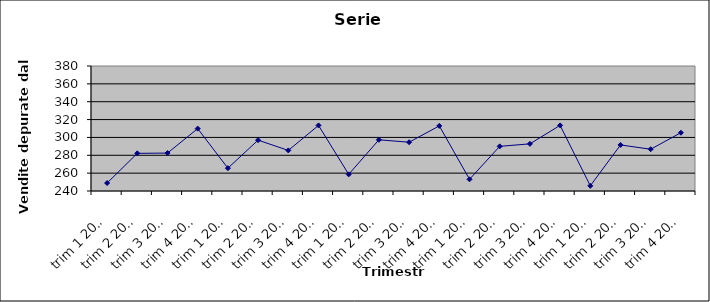
| Category | Serie detrendizzata |
|---|---|
| trim 1 2001 | 248.894 |
| trim 2 2001 | 282.187 |
| trim 3 2001 | 282.481 |
| trim 4 2001 | 309.875 |
| trim 1 2002 | 265.569 |
| trim 2 2002 | 296.962 |
| trim 3 2002 | 285.456 |
| trim 4 2002 | 313.45 |
| trim 1 2003 | 258.644 |
| trim 2 2003 | 297.337 |
| trim 3 2003 | 294.631 |
| trim 4 2003 | 312.925 |
| trim 1 2004 | 253.119 |
| trim 2 2004 | 290.012 |
| trim 3 2004 | 292.806 |
| trim 4 2004 | 313.5 |
| trim 1 2005 | 245.794 |
| trim 2 2005 | 291.587 |
| trim 3 2005 | 286.781 |
| trim 4 2005 | 305.275 |